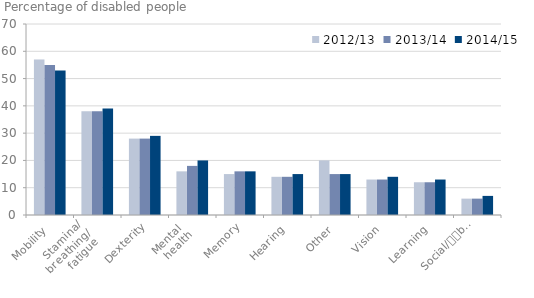
| Category | 2012/13 | 2013/14 | 2014/15 |
|---|---|---|---|
| Mobility | 57 | 55 | 53 |
| Stamina/
breathing/
fatigue | 38 | 38 | 39 |
| Dexterity | 28 | 28 | 29 |
| Mental 
health | 16 | 18 | 20 |
| Memory | 15 | 16 | 16 |
| Hearing | 14 | 14 | 15 |
| Other | 20 | 15 | 15 |
| Vision | 13 | 13 | 14 |
| Learning | 12 | 12 | 13 |
| Social/
behavioural | 6 | 6 | 7 |